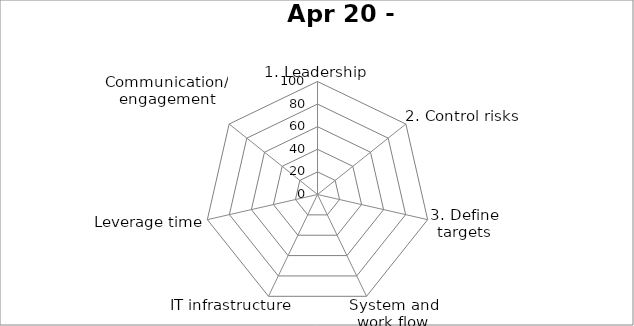
| Category | Series 0 |
|---|---|
| 1. Leadership | 0 |
| 2. Control risks | 0 |
| 3. Define targets | 0 |
| System and work flow | 0 |
| IT infrastructure | 0 |
| Leverage time | 0 |
| Communication/
engagement | 0 |